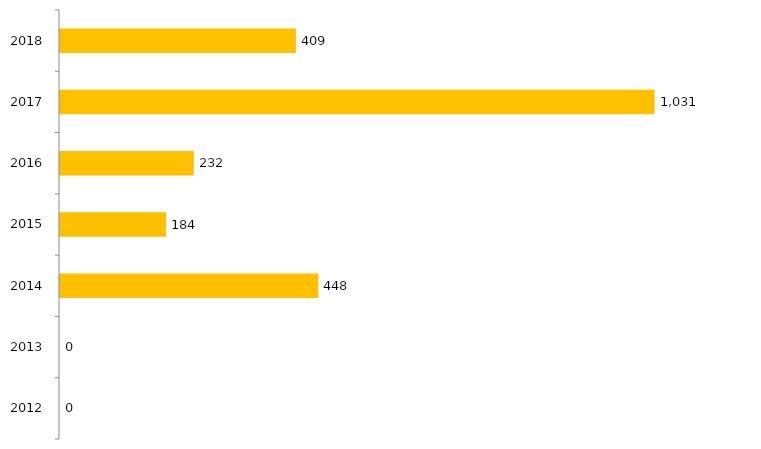
| Category | Inscritos |
|---|---|
| 2012.0 | 0 |
| 2013.0 | 0 |
| 2014.0 | 448 |
| 2015.0 | 184 |
| 2016.0 | 232 |
| 2017.0 | 1031 |
| 2018.0 | 409 |